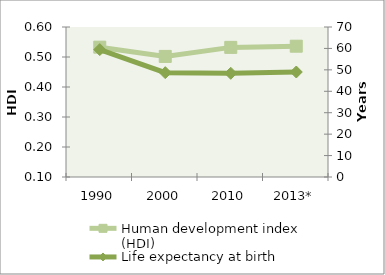
| Category | Human development index (HDI) |
|---|---|
| 1990 | 0.533 |
| 2000 | 0.502 |
| 2010 | 0.532 |
| 2013* | 0.536 |